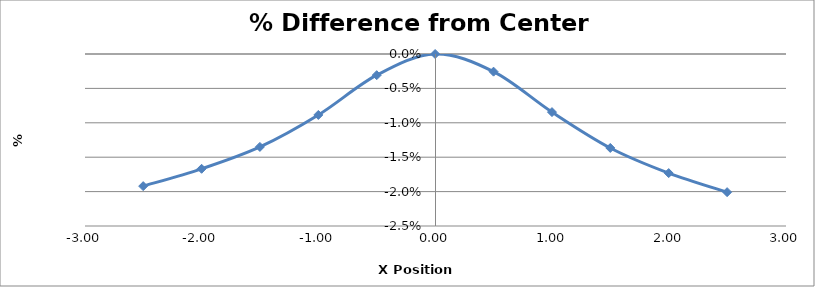
| Category | Series 0 |
|---|---|
| -2.502 | -0.019 |
| -2.002 | -0.017 |
| -1.5030000000000001 | -0.014 |
| -1.0030000000000001 | -0.009 |
| -0.5030000000000001 | -0.003 |
| -0.0030000000000001137 | 0 |
| 0.4969999999999999 | -0.003 |
| 0.9969999999999999 | -0.008 |
| 1.4959999999999996 | -0.014 |
| 1.9959999999999996 | -0.017 |
| 2.4959999999999996 | -0.02 |